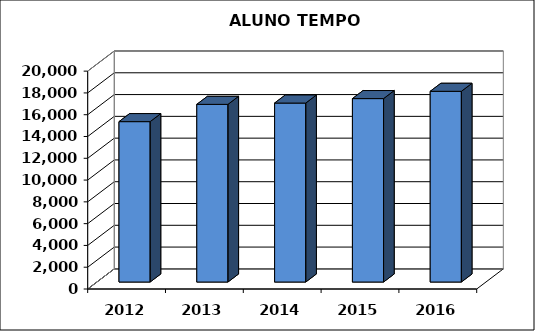
| Category | Series 0 |
|---|---|
| 2012.0 | 14723.92 |
| 2013.0 | 16310.11 |
| 2014.0 | 16430.531 |
| 2015.0 | 16838.848 |
| 2016.0 | 17507.136 |